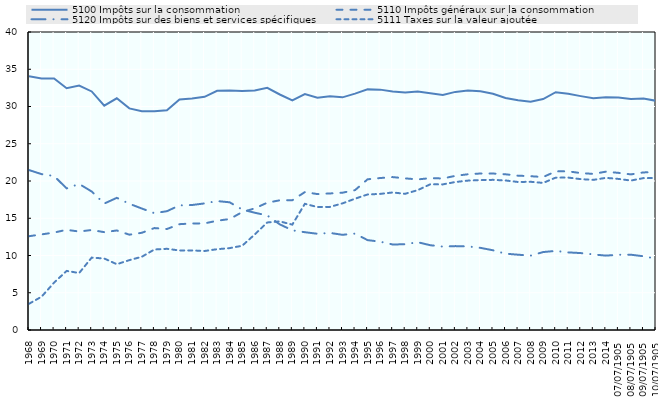
| Category | 5100 Impôts sur la consommation | 5110 Impôts généraux sur la consommation | 5120 Impôts sur des biens et services spécifiques | 5111 Taxes sur la valeur ajoutée |
|---|---|---|---|---|
| 1968 | 34.057 | 12.589 | 21.468 | 3.518 |
| 1969 | 33.757 | 12.832 | 20.925 | 4.467 |
| 1970 | 33.753 | 13.081 | 20.668 | 6.356 |
| 1971 | 32.46 | 13.448 | 19.01 | 7.933 |
| 1972 | 32.817 | 13.214 | 19.601 | 7.646 |
| 1973 | 32.019 | 13.426 | 18.59 | 9.716 |
| 1974 | 30.104 | 13.132 | 16.969 | 9.596 |
| 1975 | 31.102 | 13.359 | 17.74 | 8.832 |
| 1976 | 29.747 | 12.797 | 16.948 | 9.376 |
| 1977 | 29.358 | 13.052 | 16.302 | 9.834 |
| 1978 | 29.366 | 13.681 | 15.681 | 10.807 |
| 1979 | 29.507 | 13.556 | 15.947 | 10.898 |
| 1980 | 30.939 | 14.204 | 16.727 | 10.674 |
| 1981 | 31.084 | 14.305 | 16.777 | 10.683 |
| 1982 | 31.3 | 14.309 | 16.991 | 10.606 |
| 1983 | 32.109 | 14.67 | 17.308 | 10.844 |
| 1984 | 32.143 | 14.893 | 17.141 | 10.992 |
| 1985 | 32.083 | 15.828 | 16.174 | 11.308 |
| 1986 | 32.139 | 16.323 | 15.741 | 12.822 |
| 1987 | 32.513 | 17.092 | 15.375 | 14.436 |
| 1988 | 31.611 | 17.41 | 14.178 | 14.574 |
| 1989 | 30.824 | 17.417 | 13.382 | 14.144 |
| 1990 | 31.664 | 18.514 | 13.126 | 16.938 |
| 1991 | 31.187 | 18.245 | 12.918 | 16.506 |
| 1992 | 31.379 | 18.329 | 13.031 | 16.525 |
| 1993 | 31.227 | 18.43 | 12.777 | 16.998 |
| 1994 | 31.733 | 18.776 | 12.938 | 17.623 |
| 1995 | 32.299 | 20.227 | 12.063 | 18.195 |
| 1996 | 32.264 | 20.397 | 11.861 | 18.268 |
| 1997 | 32.014 | 20.525 | 11.48 | 18.46 |
| 1998 | 31.867 | 20.352 | 11.508 | 18.283 |
| 1999 | 32.002 | 20.214 | 11.782 | 18.775 |
| 2000 | 31.765 | 20.382 | 11.379 | 19.559 |
| 2001 | 31.542 | 20.34 | 11.196 | 19.545 |
| 2002 | 31.959 | 20.694 | 11.26 | 19.864 |
| 2003 | 32.133 | 20.905 | 11.223 | 20.051 |
| 2004 | 32.037 | 21.006 | 11.024 | 20.125 |
| 2005 | 31.711 | 21.001 | 10.703 | 20.153 |
| 2006 | 31.151 | 20.901 | 10.244 | 20.071 |
| 2007 | 30.826 | 20.713 | 10.108 | 19.868 |
| 2008 | 30.631 | 20.646 | 9.979 | 19.895 |
| 2009 | 30.994 | 20.528 | 10.461 | 19.744 |
| 2010 | 31.918 | 21.294 | 10.619 | 20.451 |
| 2011 | 31.716 | 21.296 | 10.416 | 20.46 |
| 2012 | 31.394 | 21.063 | 10.326 | 20.249 |
| 2013 | 31.107 | 20.955 | 10.145 | 20.15 |
| 2014 | 31.241 | 21.252 | 9.983 | 20.423 |
| 2015 | 31.201 | 21.094 | 10.101 | 20.281 |
| 2016 | 30.998 | 20.886 | 10.105 | 20.06 |
| 2017 | 31.057 | 21.154 | 9.897 | 20.386 |
| 2018 | 30.767 | 21.187 | 9.573 | 20.409 |